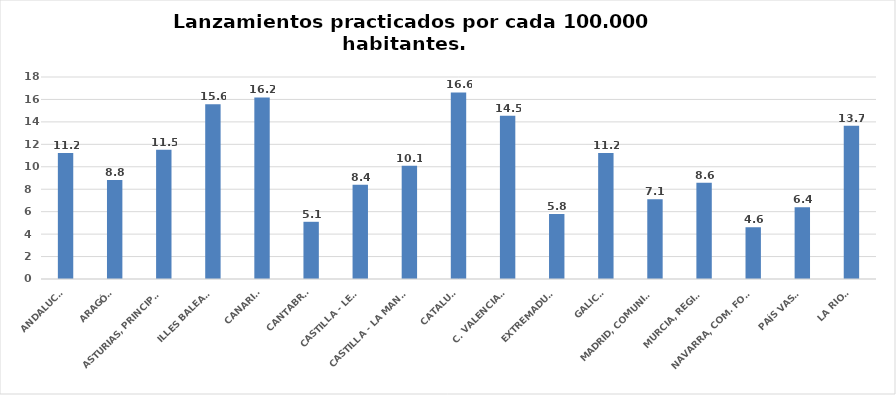
| Category | Series 0 |
|---|---|
| ANDALUCÍA | 11.218 |
| ARAGÓN | 8.819 |
| ASTURIAS, PRINCIPADO | 11.524 |
| ILLES BALEARS | 15.579 |
| CANARIAS | 16.178 |
| CANTABRIA | 5.097 |
| CASTILLA - LEÓN | 8.394 |
| CASTILLA - LA MANCHA | 10.093 |
| CATALUÑA | 16.622 |
| C. VALENCIANA | 14.545 |
| EXTREMADURA | 5.786 |
| GALICIA | 11.223 |
| MADRID, COMUNIDAD | 7.096 |
| MURCIA, REGIÓN | 8.566 |
| NAVARRA, COM. FORAL | 4.612 |
| PAÍS VASCO | 6.397 |
| LA RIOJA | 13.653 |